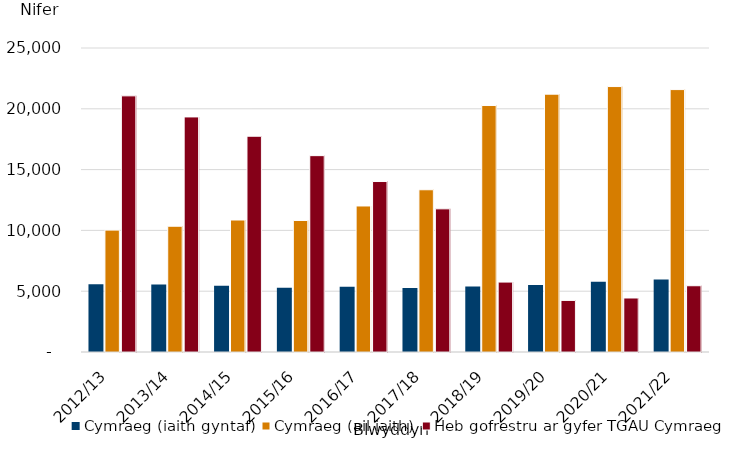
| Category | Cymraeg (iaith gyntaf) | Cymraeg (ail iaith) | Heb gofrestru ar gyfer TGAU Cymraeg |
|---|---|---|---|
| 2012/13 | 5580 | 10024 | 21065 |
| 2013/14 | 5541 | 10343 | 19332 |
| 2014/15 | 5444 | 10855 | 17745 |
| 2015/16 | 5285 | 10816 | 16147 |
| 2016/17 | 5365 | 12009 | 14020 |
| 2017/18 | 5266 | 13342 | 11774 |
| 2018/19 | 5385 | 20270 | 5750 |
| 2019/20 | 5515 | 21203 | 4242 |
| 2020/21 | 5782 | 21829 | 4442 |
| 2021/22 | 5972 | 21580 | 5449 |